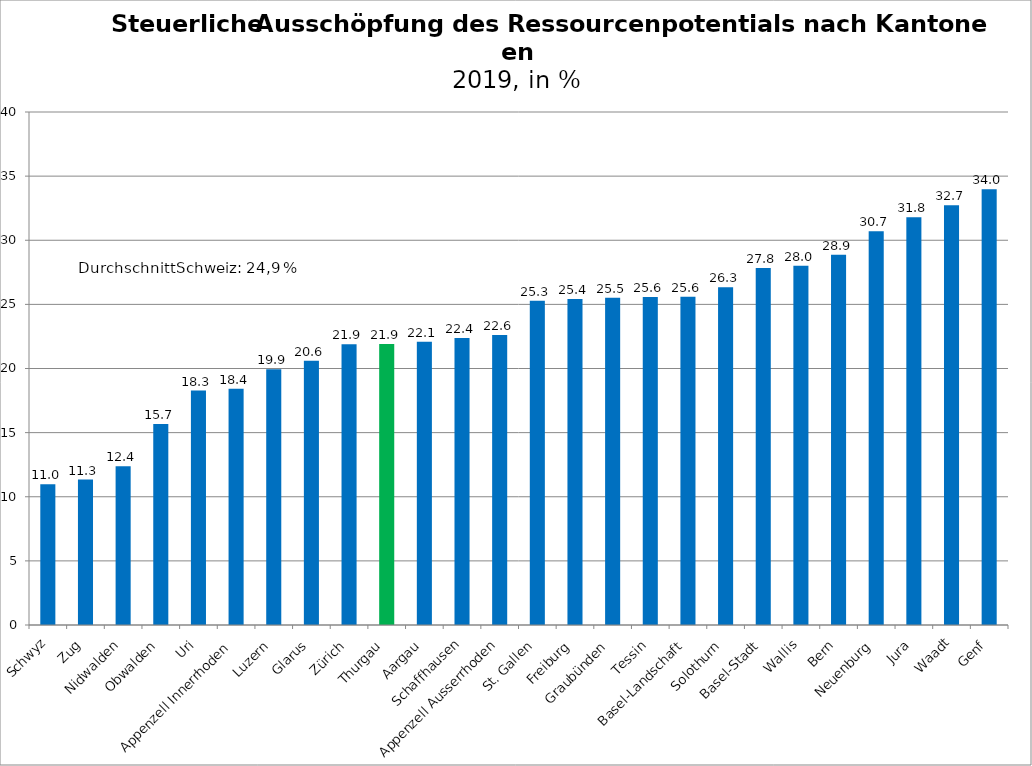
| Category | Series 0 |
|---|---|
| Schwyz | 10.984 |
| Zug | 11.34 |
| Nidwalden | 12.387 |
| Obwalden | 15.664 |
| Uri | 18.284 |
| Appenzell Innerrhoden | 18.426 |
| Luzern | 19.944 |
| Glarus | 20.61 |
| Zürich | 21.883 |
| Thurgau | 21.918 |
| Aargau | 22.092 |
| Schaffhausen | 22.38 |
| Appenzell Ausserrhoden | 22.621 |
| St. Gallen | 25.282 |
| Freiburg | 25.424 |
| Graubünden | 25.526 |
| Tessin | 25.576 |
| Basel-Landschaft | 25.601 |
| Solothurn | 26.335 |
| Basel-Stadt | 27.845 |
| Wallis | 28.008 |
| Bern | 28.875 |
| Neuenburg | 30.697 |
| Jura | 31.793 |
| Waadt | 32.722 |
| Genf | 33.982 |